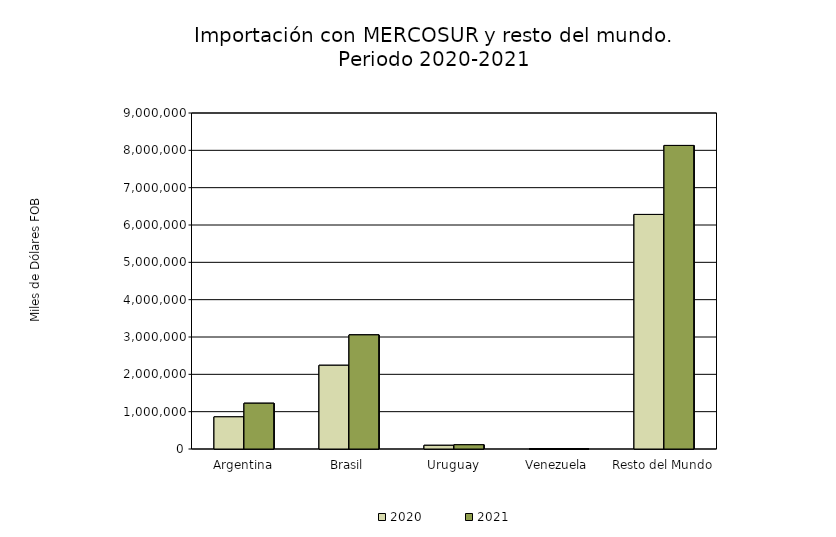
| Category | 2020 | 2021 |
|---|---|---|
| Argentina | 861654.14 | 1225413.86 |
| Brasil | 2242046.7 | 3056165.7 |
| Uruguay | 98312.25 | 113117.84 |
| Venezuela | 38.74 | 148.71 |
| Resto del Mundo | 6282499.78 | 8130631.75 |